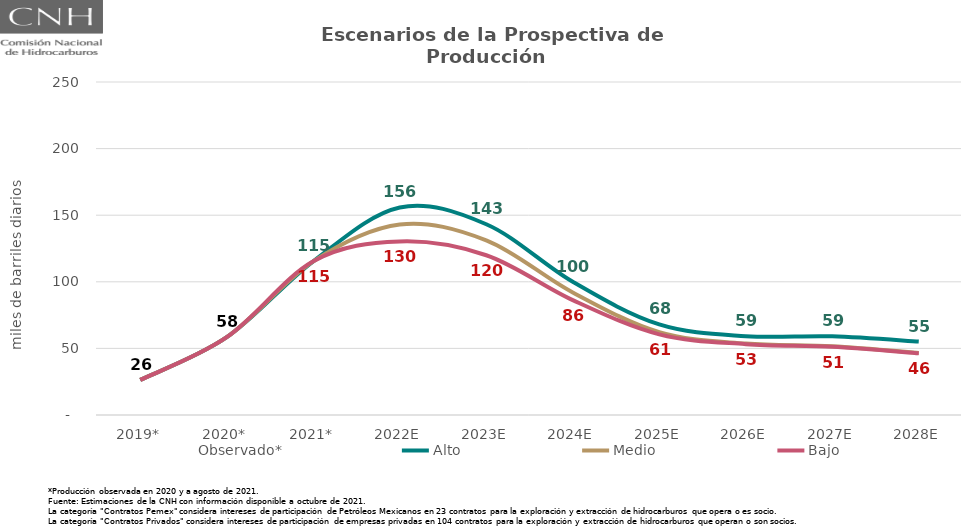
| Category | Observado* | Alto | Medio | Bajo |
|---|---|---|---|---|
| 2019* | 26.35 | 26.35 | 26.35 | 26.35 |
| 2020* | 58.4 | 58.4 | 58.4 | 58.4 |
| 2021* | 115.364 | 115.364 | 115.364 | 115.364 |
| 2022E | 143.035 | 155.819 | 143.035 | 130.283 |
| 2023E | 131.133 | 143.215 | 131.133 | 119.938 |
| 2024E | 92.005 | 100.005 | 92.005 | 86.246 |
| 2025E | 62.171 | 68.017 | 62.171 | 60.571 |
| 2026E | 53.634 | 59.201 | 53.634 | 53.171 |
| 2027E | 51.61 | 59.051 | 51.61 | 51.203 |
| 2028E | 46.584 | 55.173 | 46.584 | 46.384 |